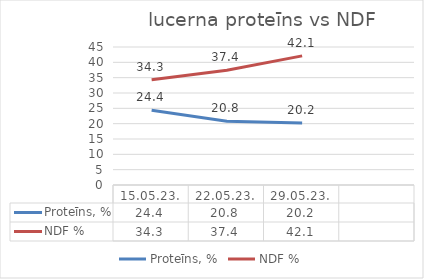
| Category | Proteīns, % | NDF % |
|---|---|---|
| 15.05.23. | 24.4 | 34.3 |
| 22.05.23. | 20.8 | 37.4 |
| 29.05.23. | 20.2 | 42.1 |